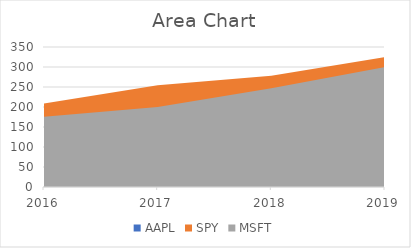
| Category | AAPL | SPY | MSFT |
|---|---|---|---|
| 2016.0 | 110.08 | 208.72 | 175.65 |
| 2017.0 | 163.43 | 254.22 | 200 |
| 2018.0 | 224 | 278 | 247 |
| 2019.0 | 150 | 325 | 300 |